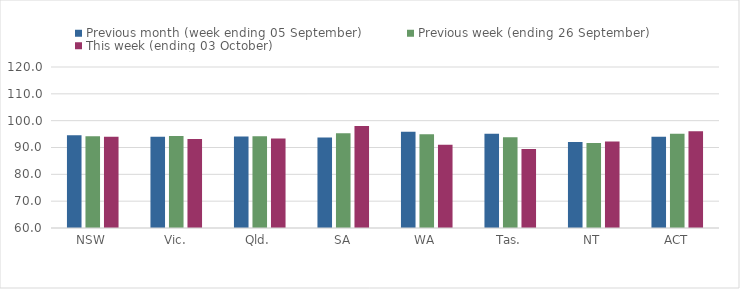
| Category | Previous month (week ending 05 September) | Previous week (ending 26 September) | This week (ending 03 October) |
|---|---|---|---|
| NSW | 94.52 | 94.21 | 93.96 |
| Vic. | 94.05 | 94.3 | 93.13 |
| Qld. | 94.13 | 94.15 | 93.36 |
| SA | 93.76 | 95.3 | 98.02 |
| WA | 95.9 | 94.96 | 91.02 |
| Tas. | 95.16 | 93.82 | 89.4 |
| NT | 92.09 | 91.71 | 92.22 |
| ACT | 93.96 | 95.12 | 96.05 |